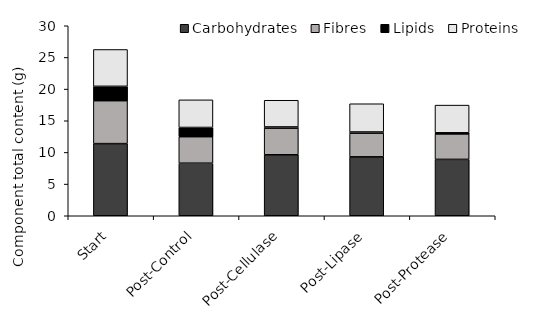
| Category | Carbohydrates | Fibres | Lipids | Proteins  |
|---|---|---|---|---|
| Start | 11.389 | 6.778 | 2.27 | 5.817 |
| Post-Control | 8.3 | 4.182 | 1.455 | 4.364 |
| Post-Cellulase | 9.628 | 4.214 | 0.183 | 4.214 |
| Post-Lipase | 9.303 | 3.746 | 0.178 | 4.459 |
| Post-Protease | 8.902 | 4.022 | 0.175 | 4.372 |